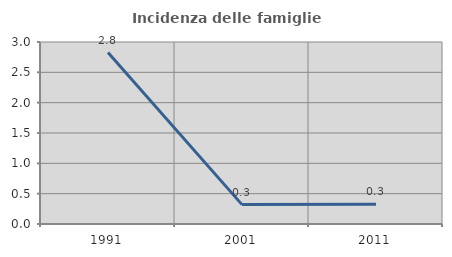
| Category | Incidenza delle famiglie numerose |
|---|---|
| 1991.0 | 2.827 |
| 2001.0 | 0.319 |
| 2011.0 | 0.326 |